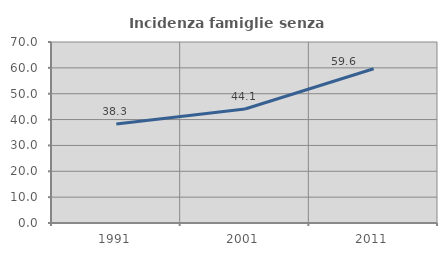
| Category | Incidenza famiglie senza nuclei |
|---|---|
| 1991.0 | 38.287 |
| 2001.0 | 44.086 |
| 2011.0 | 59.643 |